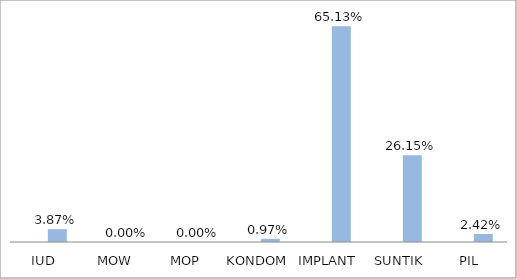
| Category | Series 0 | Series 1 |
|---|---|---|
| IUD |  | 0.039 |
| MOW |  | 0 |
| MOP |  | 0 |
| KONDOM |  | 0.01 |
| IMPLANT |  | 0.651 |
| SUNTIK |  | 0.262 |
| PIL |  | 0.024 |